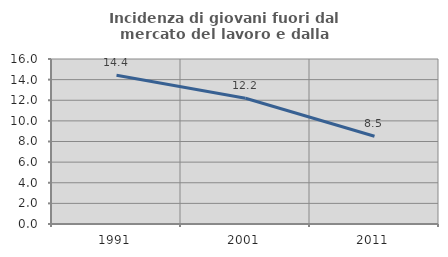
| Category | Incidenza di giovani fuori dal mercato del lavoro e dalla formazione  |
|---|---|
| 1991.0 | 14.416 |
| 2001.0 | 12.188 |
| 2011.0 | 8.511 |